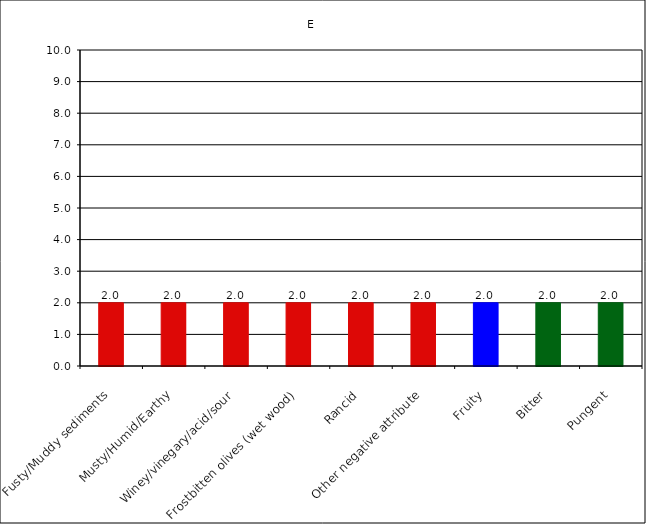
| Category | E |
|---|---|
| Fusty/Muddy sediments | 2 |
| Musty/Humid/Earthy | 2 |
| Winey/vinegary/acid/sour | 2 |
| Frostbitten olives (wet wood) | 2 |
| Rancid | 2 |
| Other negative attribute | 2 |
| Fruity | 2 |
| Bitter | 2 |
| Pungent | 2 |